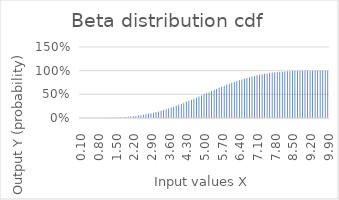
| Category | Series 0 |
|---|---|
| 0.1 | 0 |
| 0.2 | 0 |
| 0.30000000000000004 | 0 |
| 0.4 | 0 |
| 0.5 | 0 |
| 0.6 | 0 |
| 0.7 | 0 |
| 0.7999999999999999 | 0.001 |
| 0.8999999999999999 | 0.001 |
| 0.9999999999999999 | 0.002 |
| 1.0999999999999999 | 0.002 |
| 1.2 | 0.003 |
| 1.3 | 0.005 |
| 1.4000000000000001 | 0.006 |
| 1.5000000000000002 | 0.008 |
| 1.6000000000000003 | 0.011 |
| 1.7000000000000004 | 0.014 |
| 1.8000000000000005 | 0.017 |
| 1.9000000000000006 | 0.021 |
| 2.0000000000000004 | 0.026 |
| 2.1000000000000005 | 0.031 |
| 2.2000000000000006 | 0.037 |
| 2.3000000000000007 | 0.043 |
| 2.400000000000001 | 0.051 |
| 2.500000000000001 | 0.059 |
| 2.600000000000001 | 0.068 |
| 2.700000000000001 | 0.077 |
| 2.800000000000001 | 0.088 |
| 2.9000000000000012 | 0.099 |
| 3.0000000000000013 | 0.111 |
| 3.1000000000000014 | 0.125 |
| 3.2000000000000015 | 0.138 |
| 3.3000000000000016 | 0.153 |
| 3.4000000000000017 | 0.169 |
| 3.5000000000000018 | 0.185 |
| 3.600000000000002 | 0.202 |
| 3.700000000000002 | 0.22 |
| 3.800000000000002 | 0.239 |
| 3.900000000000002 | 0.258 |
| 4.000000000000002 | 0.278 |
| 4.100000000000001 | 0.298 |
| 4.200000000000001 | 0.319 |
| 4.300000000000001 | 0.341 |
| 4.4 | 0.363 |
| 4.5 | 0.385 |
| 4.6 | 0.408 |
| 4.699999999999999 | 0.43 |
| 4.799999999999999 | 0.454 |
| 4.899999999999999 | 0.477 |
| 4.999999999999998 | 0.5 |
| 5.099999999999998 | 0.523 |
| 5.1999999999999975 | 0.546 |
| 5.299999999999997 | 0.57 |
| 5.399999999999997 | 0.592 |
| 5.4999999999999964 | 0.615 |
| 5.599999999999996 | 0.637 |
| 5.699999999999996 | 0.659 |
| 5.799999999999995 | 0.681 |
| 5.899999999999995 | 0.702 |
| 5.999999999999995 | 0.722 |
| 6.099999999999994 | 0.742 |
| 6.199999999999994 | 0.761 |
| 6.299999999999994 | 0.78 |
| 6.399999999999993 | 0.798 |
| 6.499999999999993 | 0.815 |
| 6.5999999999999925 | 0.831 |
| 6.699999999999992 | 0.847 |
| 6.799999999999992 | 0.862 |
| 6.8999999999999915 | 0.875 |
| 6.999999999999991 | 0.889 |
| 7.099999999999991 | 0.901 |
| 7.19999999999999 | 0.912 |
| 7.29999999999999 | 0.923 |
| 7.39999999999999 | 0.932 |
| 7.499999999999989 | 0.941 |
| 7.599999999999989 | 0.949 |
| 7.699999999999989 | 0.957 |
| 7.799999999999988 | 0.963 |
| 7.899999999999988 | 0.969 |
| 7.999999999999988 | 0.974 |
| 8.099999999999987 | 0.979 |
| 8.199999999999987 | 0.983 |
| 8.299999999999986 | 0.986 |
| 8.399999999999986 | 0.989 |
| 8.499999999999986 | 0.992 |
| 8.599999999999985 | 0.994 |
| 8.699999999999985 | 0.995 |
| 8.799999999999985 | 0.997 |
| 8.899999999999984 | 0.998 |
| 8.999999999999984 | 0.998 |
| 9.099999999999984 | 0.999 |
| 9.199999999999983 | 0.999 |
| 9.299999999999983 | 1 |
| 9.399999999999983 | 1 |
| 9.499999999999982 | 1 |
| 9.599999999999982 | 1 |
| 9.699999999999982 | 1 |
| 9.799999999999981 | 1 |
| 9.89999999999998 | 1 |